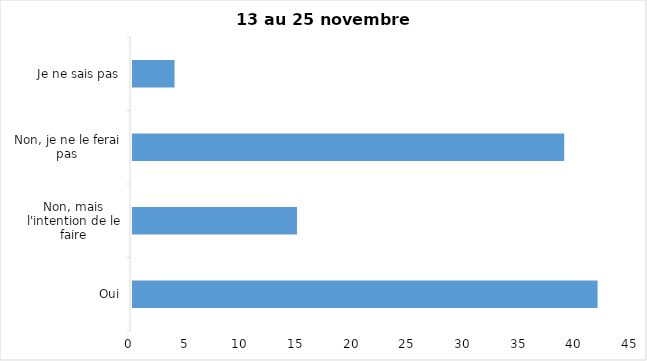
| Category | Series 0 |
|---|---|
| Oui | 42 |
| Non, mais l'intention de le faire | 15 |
| Non, je ne le ferai pas | 39 |
| Je ne sais pas | 4 |